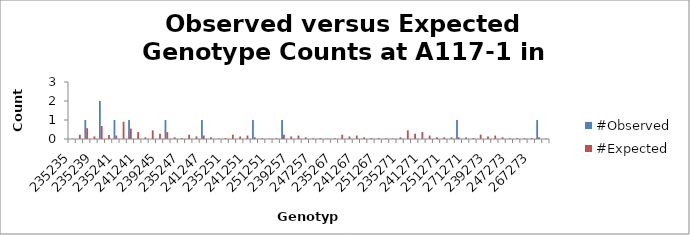
| Category | #Observed | #Expected |
|---|---|---|
| 235235.0 | 0 | 0.023 |
| 235237.0 | 0 | 0.227 |
| 237237.0 | 1 | 0.568 |
| 235239.0 | 0 | 0.136 |
| 237239.0 | 2 | 0.682 |
| 239239.0 | 0 | 0.205 |
| 235241.0 | 1 | 0.182 |
| 237241.0 | 0 | 0.909 |
| 239241.0 | 1 | 0.545 |
| 241241.0 | 0 | 0.364 |
| 235245.0 | 0 | 0.091 |
| 237245.0 | 0 | 0.455 |
| 239245.0 | 0 | 0.273 |
| 241245.0 | 1 | 0.364 |
| 245245.0 | 0 | 0.091 |
| 235247.0 | 0 | 0.045 |
| 237247.0 | 0 | 0.227 |
| 239247.0 | 0 | 0.136 |
| 241247.0 | 1 | 0.182 |
| 245247.0 | 0 | 0.091 |
| 247247.0 | 0 | 0.023 |
| 235251.0 | 0 | 0.045 |
| 237251.0 | 0 | 0.227 |
| 239251.0 | 0 | 0.136 |
| 241251.0 | 0 | 0.182 |
| 245251.0 | 1 | 0.091 |
| 247251.0 | 0 | 0.045 |
| 251251.0 | 0 | 0.023 |
| 235257.0 | 0 | 0.045 |
| 237257.0 | 1 | 0.227 |
| 239257.0 | 0 | 0.136 |
| 241257.0 | 0 | 0.182 |
| 245257.0 | 0 | 0.091 |
| 247257.0 | 0 | 0.045 |
| 251257.0 | 0 | 0.045 |
| 257257.0 | 0 | 0.023 |
| 235267.0 | 0 | 0.045 |
| 237267.0 | 0 | 0.227 |
| 239267.0 | 0 | 0.136 |
| 241267.0 | 0 | 0.182 |
| 245267.0 | 0 | 0.091 |
| 247267.0 | 0 | 0.045 |
| 251267.0 | 0 | 0.045 |
| 257267.0 | 0 | 0.045 |
| 267267.0 | 0 | 0.023 |
| 235271.0 | 0 | 0.091 |
| 237271.0 | 0 | 0.455 |
| 239271.0 | 0 | 0.273 |
| 241271.0 | 0 | 0.364 |
| 245271.0 | 0 | 0.182 |
| 247271.0 | 0 | 0.091 |
| 251271.0 | 0 | 0.091 |
| 257271.0 | 0 | 0.091 |
| 267271.0 | 1 | 0.091 |
| 271271.0 | 0 | 0.091 |
| 235273.0 | 0 | 0.045 |
| 237273.0 | 0 | 0.227 |
| 239273.0 | 0 | 0.136 |
| 241273.0 | 0 | 0.182 |
| 245273.0 | 0 | 0.091 |
| 247273.0 | 0 | 0.045 |
| 251273.0 | 0 | 0.045 |
| 257273.0 | 0 | 0.045 |
| 267273.0 | 0 | 0.045 |
| 271273.0 | 1 | 0.091 |
| 273273.0 | 0 | 0.023 |